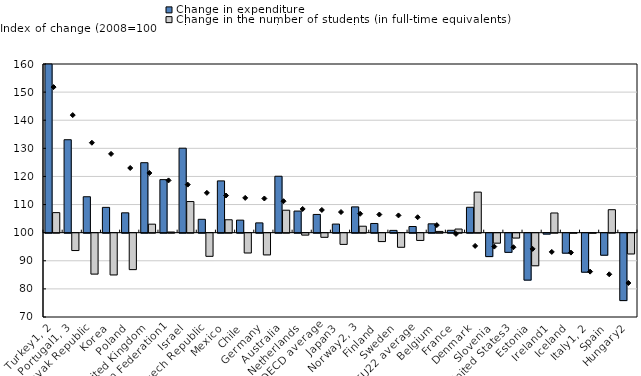
| Category | Change in expenditure | Change in the number of students (in full-time equivalents) |
|---|---|---|
| Turkey1, 2 | 162.612 | 107.133 |
| Portugal1, 3 | 133.063 | 93.821 |
| Slovak Republic | 112.78 | 85.441 |
| Korea | 109 | 85.143 |
| Poland | 107.062 | 87.035 |
| United Kingdom | 124.892 | 103.024 |
| Russian Federation1 | 118.866 | 100.228 |
| Israel | 130.049 | 111.068 |
| Czech Republic | 104.756 | 91.764 |
| Mexico | 118.416 | 104.588 |
| Chile | 104.457 | 92.954 |
| Germany | 103.482 | 92.267 |
| Australia | 120.072 | 107.988 |
| Netherlands | 107.687 | 99.312 |
| OECD average | 106.483 | 98.529 |
| Japan3 | 103.056 | 96.005 |
| Norway2, 3 | 109.169 | 102.295 |
| Finland | 103.267 | 97.008 |
| Sweden | 100.811 | 94.983 |
| EU22 average | 102.191 | 97.411 |
| Belgium | 103.146 | 100.444 |
| France | 100.845 | 101.289 |
| Denmark | 109.036 | 114.427 |
| Slovenia | 91.669 | 96.445 |
| United States3 | 93.176 | 98.265 |
| Estonia | 83.3 | 88.398 |
| Ireland1 | 99.671 | 107.004 |
| Iceland | 92.881 | 99.973 |
| Italy1, 2 | 86.111 | 99.97 |
| Spain | 92.152 | 108.17 |
| Hungary2 | 76.017 | 92.601 |